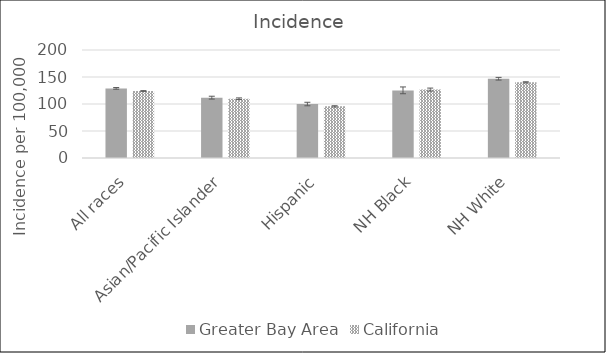
| Category | Greater Bay Area | California | SEER 18 |
|---|---|---|---|
| All races | 128.93 | 124.07 |  |
| Asian/Pacific Islander | 111.75 | 109.74 |  |
| Hispanic | 99.91 | 95.65 |  |
| NH Black | 125.17 | 126.69 |  |
| NH White | 146.78 | 140.1 |  |